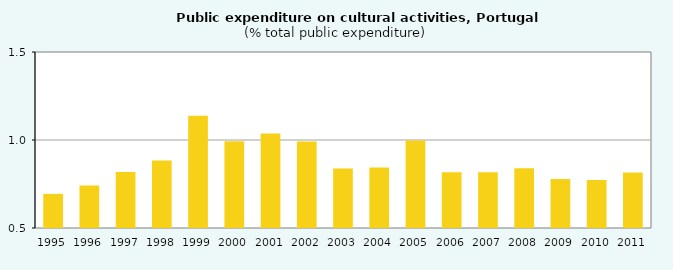
| Category | Portugal |
|---|---|
| 1995.0 | 0.694 |
| 1996.0 | 0.742 |
| 1997.0 | 0.818 |
| 1998.0 | 0.883 |
| 1999.0 | 1.137 |
| 2000.0 | 0.993 |
| 2001.0 | 1.038 |
| 2002.0 | 0.991 |
| 2003.0 | 0.837 |
| 2004.0 | 0.843 |
| 2005.0 | 0.998 |
| 2006.0 | 0.817 |
| 2007.0 | 0.817 |
| 2008.0 | 0.84 |
| 2009.0 | 0.779 |
| 2010.0 | 0.772 |
| 2011.0 | 0.815 |